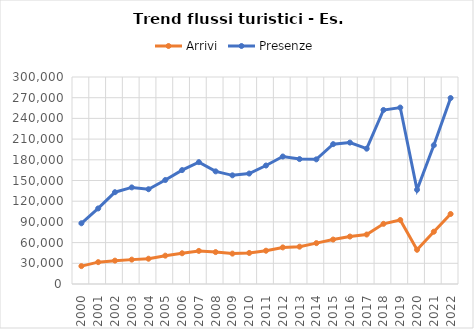
| Category | Arrivi | Presenze |
|---|---|---|
| 2000.0 | 25936 | 88016 |
| 2001.0 | 31670 | 109490 |
| 2002.0 | 33863 | 133033 |
| 2003.0 | 35329 | 139993 |
| 2004.0 | 36634 | 137365 |
| 2005.0 | 41083 | 150719 |
| 2006.0 | 44537 | 165090 |
| 2007.0 | 47954 | 176611 |
| 2008.0 | 46259 | 163240 |
| 2009.0 | 44041 | 157485 |
| 2010.0 | 45003 | 160095 |
| 2011.0 | 48255 | 171710 |
| 2012.0 | 53030 | 184757 |
| 2013.0 | 54106 | 181063 |
| 2014.0 | 59221 | 180654 |
| 2015.0 | 64435 | 202666 |
| 2016.0 | 68793 | 204942 |
| 2017.0 | 71725 | 196111 |
| 2018.0 | 87178 | 252180 |
| 2019.0 | 92762 | 255706 |
| 2020.0 | 49602 | 136548 |
| 2021.0 | 75754 | 201131 |
| 2022.0 | 101444 | 269523 |